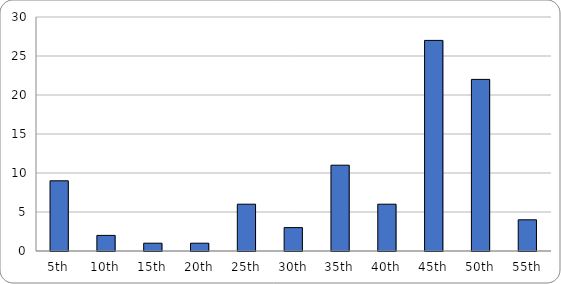
| Category | Number of Deaths Between Reunions |
|---|---|
| 5th | 9 |
| 10th | 2 |
| 15th | 1 |
| 20th | 1 |
| 25th | 6 |
| 30th | 3 |
| 35th | 11 |
| 40th | 6 |
| 45th | 27 |
| 50th | 22 |
| 55th | 4 |